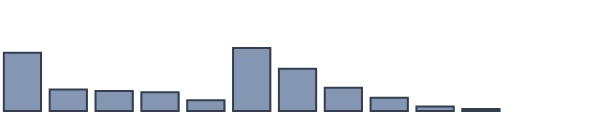
| Category | Series 0 |
|---|---|
| 0 | 20.985 |
| 1 | 7.727 |
| 2 | 7.197 |
| 3 | 6.742 |
| 4 | 3.864 |
| 5 | 22.727 |
| 6 | 15.227 |
| 7 | 8.409 |
| 8 | 4.773 |
| 9 | 1.591 |
| 10 | 0.758 |
| 11 | 0 |
| 12 | 0 |